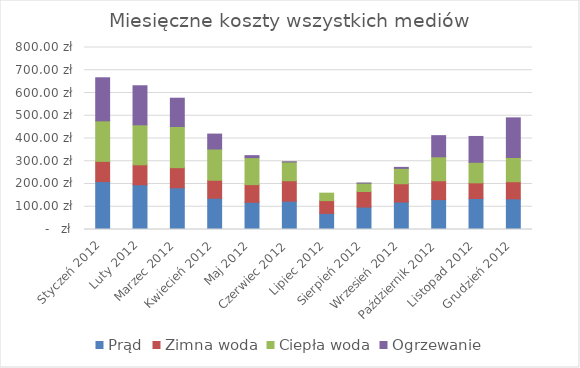
| Category | Prąd | Zimna woda | Ciepła woda | Ogrzewanie |
|---|---|---|---|---|
| Styczeń 2012 | 210.541 | 89.032 | 178.059 | 189.277 |
| Luty 2012 | 196.683 | 87.736 | 175.68 | 171.717 |
| Marzec 2012 | 183.373 | 88.354 | 180.896 | 124.444 |
| Kwiecień 2012 | 137.402 | 79.162 | 137.268 | 65.579 |
| Maj 2012 | 119.546 | 77.766 | 118.749 | 8.64 |
| Czerwiec 2012 | 124.471 | 89.81 | 82.551 | 0.622 |
| Lipiec 2012 | 70.831 | 56.088 | 32.791 | 0 |
| Sierpień 2012 | 98.424 | 68.51 | 36.602 | 0.412 |
| Wrzesień 2012 | 120.908 | 80.187 | 67.665 | 4.294 |
| Październik 2012 | 131.397 | 82.768 | 105.432 | 92.951 |
| Listopad 2012 | 136.24 | 68.889 | 90.255 | 113.63 |
| Grudzień 2012 | 134.653 | 75.461 | 106.453 | 174.154 |